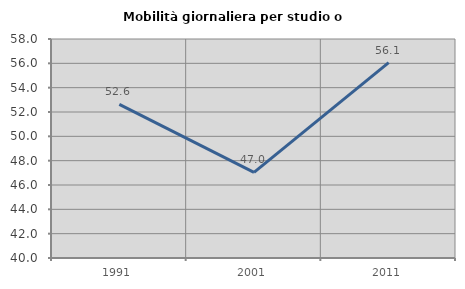
| Category | Mobilità giornaliera per studio o lavoro |
|---|---|
| 1991.0 | 52.632 |
| 2001.0 | 47.044 |
| 2011.0 | 56.056 |